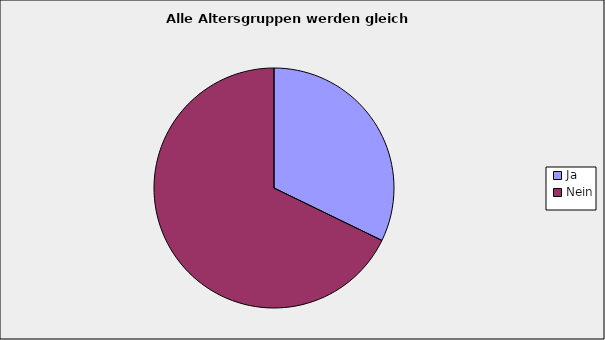
| Category | Series 0 |
|---|---|
| Ja | 0.322 |
| Nein | 0.678 |